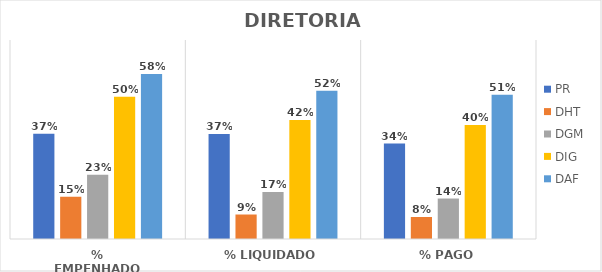
| Category | PR | DHT | DGM | DIG | DAF |
|---|---|---|---|---|---|
| % EMPENHADO | 0.371 | 0.149 | 0.226 | 0.5 | 0.581 |
| % LIQUIDADO | 0.369 | 0.086 | 0.166 | 0.419 | 0.521 |
| % PAGO | 0.336 | 0.077 | 0.142 | 0.401 | 0.507 |